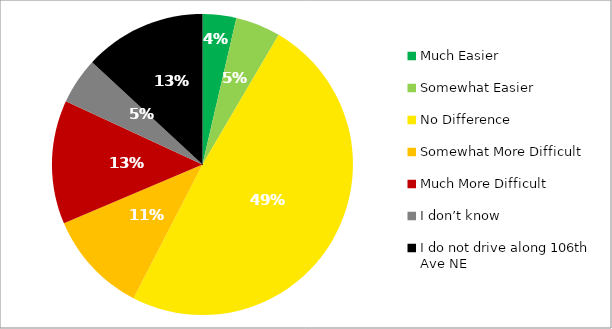
| Category | Responses |
|---|---|
| Much Easier | 0.036 |
| Somewhat Easier | 0.048 |
| No Difference | 0.491 |
| Somewhat More Difficult | 0.11 |
| Much More Difficult | 0.133 |
| I don’t know | 0.05 |
| I do not drive along 106th Ave NE | 0.131 |